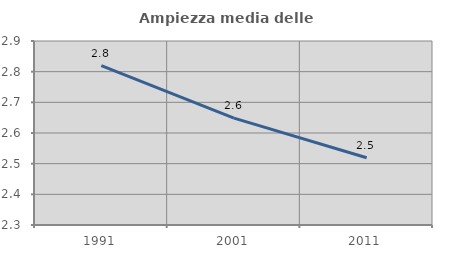
| Category | Ampiezza media delle famiglie |
|---|---|
| 1991.0 | 2.82 |
| 2001.0 | 2.648 |
| 2011.0 | 2.519 |